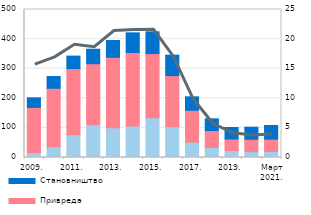
| Category | Остали сектори | Привреда | Становништво |
|---|---|---|---|
| 2009. | 16.3 | 153.043 | 32.3 |
| 2010. | 36.3 | 197.6 | 39.6 |
| 2011. | 77.1 | 223.3 | 42.2 |
| 2012. | 110.5 | 206.3 | 49 |
| 2013. | 100.2 | 238.4 | 56.7 |
| 2014. | 106.4 | 248.4 | 66.4 |
| 2015. | 134.4 | 216.8 | 73.4 |
| 2016. | 103.8 | 172.8 | 69.2 |
| 2017. | 51.9 | 107.6 | 45.4 |
| 2018. | 34.192 | 56.849 | 39.608 |
| 2019. | 23.45 | 38.949 | 39.017 |
| 2020. | 19.835 | 41.827 | 40.747 |
| Март
2021. | 20.292 | 41.688 | 46.216 |